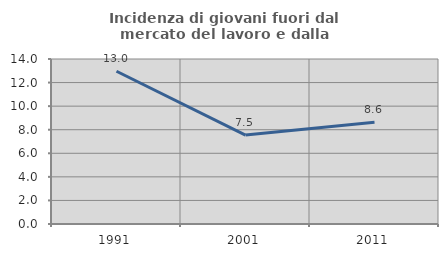
| Category | Incidenza di giovani fuori dal mercato del lavoro e dalla formazione  |
|---|---|
| 1991.0 | 12.963 |
| 2001.0 | 7.547 |
| 2011.0 | 8.642 |